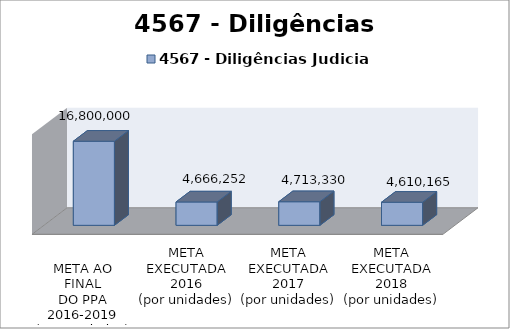
| Category | 4567 - Diligências Judiciais |
|---|---|
| 
META AO FINAL
DO PPA
2016-2019
(por unidades)
 | 16800000 |
| META EXECUTADA
2016
(por unidades) | 4666252 |
| META EXECUTADA
2017
(por unidades) | 4713330 |
| META EXECUTADA
2018
(por unidades) | 4610165 |